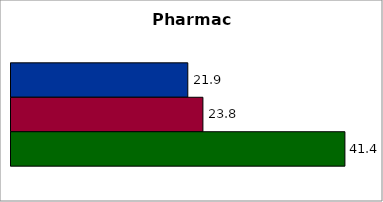
| Category | 50 states and D.C. | SREB states | State |
|---|---|---|---|
| 0 | 21.917 | 23.792 | 41.394 |